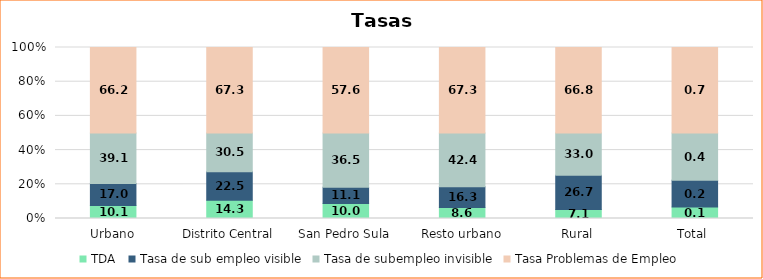
| Category | TDA  | Tasa de sub empleo visible | Tasa de subempleo invisible | Tasa Problemas de Empleo |
|---|---|---|---|---|
| Urbano | 10.115 | 17 | 39.1 | 66.215 |
| Distrito Central | 14.341 | 22.5 | 30.5 | 67.341 |
| San Pedro Sula | 10.05 | 11.1 | 36.5 | 57.65 |
| Resto urbano | 8.638 | 16.3 | 42.4 | 67.338 |
| Rural | 7.131 | 26.7 | 33 | 66.831 |
| Total | 0.089 | 0.209 | 0.367 | 0.665 |